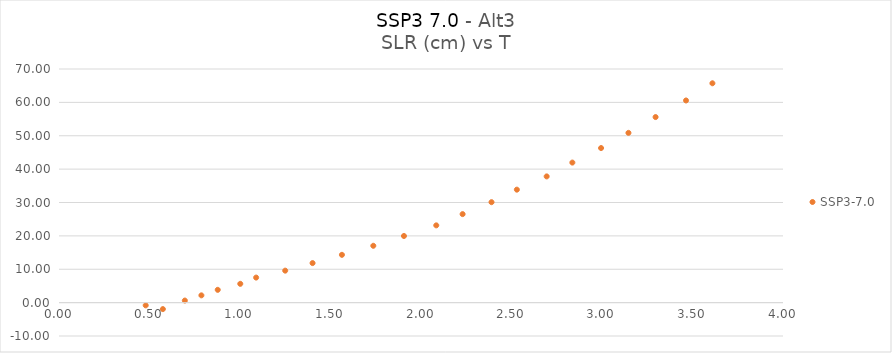
| Category | SSP3-7.0 |
|---|---|
| 0.573801925 | -1.941 |
| 0.479031654 | -0.818 |
| 0.695197934 | 0.621 |
| 0.786748548 | 2.18 |
| 0.877021499 | 3.834 |
| 1.001520332 | 5.633 |
| 1.089128948 | 7.505 |
| 1.249789297 | 9.582 |
| 1.40090264 | 11.846 |
| 1.563156875 | 14.321 |
| 1.736513554 | 17.03 |
| 1.905806517 | 19.967 |
| 2.084344689 | 23.152 |
| 2.229881962 | 26.519 |
| 2.38960776 | 30.098 |
| 2.529609917 | 33.847 |
| 2.694304026 | 37.817 |
| 2.836254375 | 41.962 |
| 2.994852826 | 46.316 |
| 3.14617335 | 50.864 |
| 3.296059987 | 55.602 |
| 3.46423146 | 60.571 |
| 3.610026207 | 65.721 |